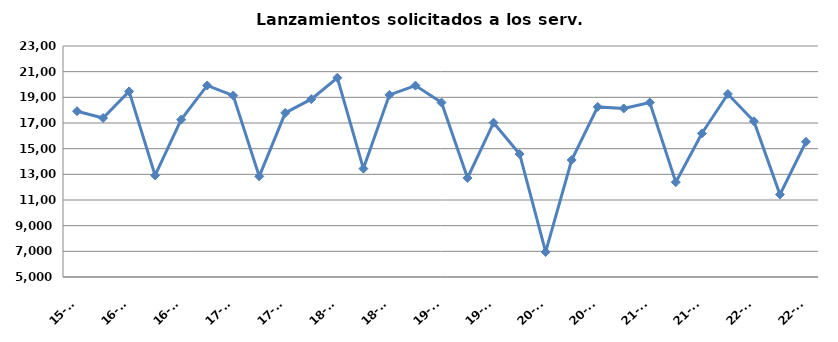
| Category | Series 0 |
|---|---|
| 15-T4 | 17921 |
| 16-T1 | 17386 |
| 16-T2 | 19461 |
| 16-T3 | 12918 |
| 16-T4 | 17265 |
| 17-T1 | 19926 |
| 17-T2 | 19141 |
| 17-T3 | 12840 |
| 17-T4 | 17786 |
| 18-T1 | 18859 |
| 18-T2 | 20526 |
| 18-T3 | 13446 |
| 18-T4 | 19192 |
| 19-T1 | 19913 |
| 19-T2 | 18594 |
| 19-T3 | 12715 |
| 19-T4 | 17025 |
| 20-T1 | 14586 |
| 20-T2 | 6953 |
| 20-T3 | 14117 |
| 20-T4 | 18255 |
| 21-T1 | 18131 |
| 21-T2 | 18598 |
| 21-T3 | 12390 |
| 21-T4 | 16187 |
| 22-T1 | 19257 |
| 22-T2 | 17134 |
| 22-T3 | 11425 |
| 22-T4 | 15536 |